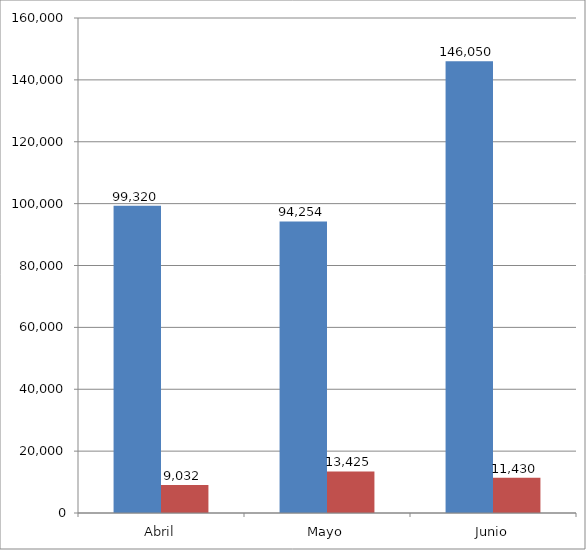
| Category | Series 0 | Series 1 |
|---|---|---|
| Abril | 99320 | 9032 |
| Mayo | 94254 | 13425 |
| Junio | 146050 | 11430 |